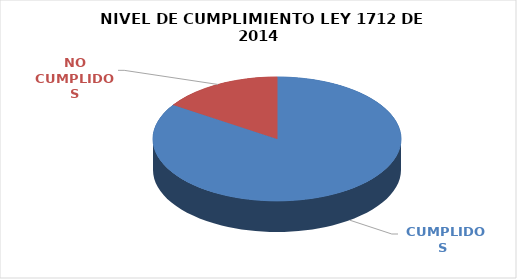
| Category | Series 0 |
|---|---|
|  CUMPLIDOS | 96 |
| NO CUMPLIDOS | 18 |